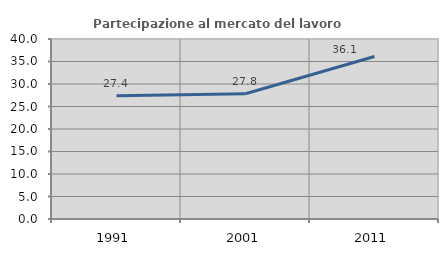
| Category | Partecipazione al mercato del lavoro  femminile |
|---|---|
| 1991.0 | 27.363 |
| 2001.0 | 27.835 |
| 2011.0 | 36.111 |